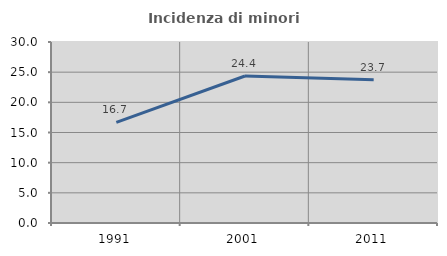
| Category | Incidenza di minori stranieri |
|---|---|
| 1991.0 | 16.667 |
| 2001.0 | 24.359 |
| 2011.0 | 23.724 |